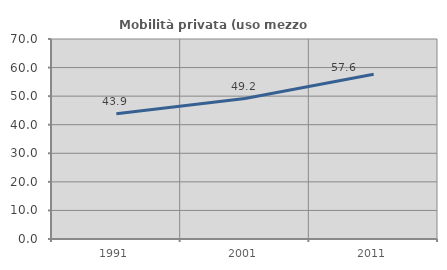
| Category | Mobilità privata (uso mezzo privato) |
|---|---|
| 1991.0 | 43.875 |
| 2001.0 | 49.153 |
| 2011.0 | 57.633 |